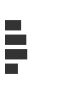
| Category | Series 0 |
|---|---|
| 0 | 0.213 |
| 1 | 0.286 |
| 2 | 0.299 |
| 3 | 0.168 |